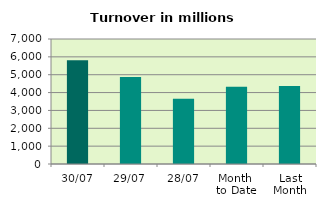
| Category | Series 0 |
|---|---|
| 30/07 | 5814.843 |
| 29/07 | 4878.96 |
| 28/07 | 3652.654 |
| Month 
to Date | 4319.965 |
| Last
Month | 4366.67 |